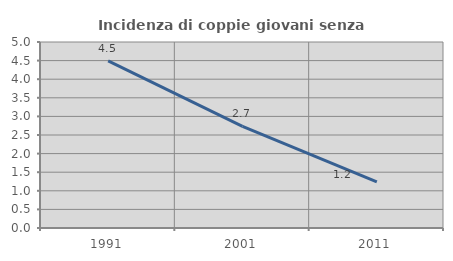
| Category | Incidenza di coppie giovani senza figli |
|---|---|
| 1991.0 | 4.491 |
| 2001.0 | 2.732 |
| 2011.0 | 1.238 |